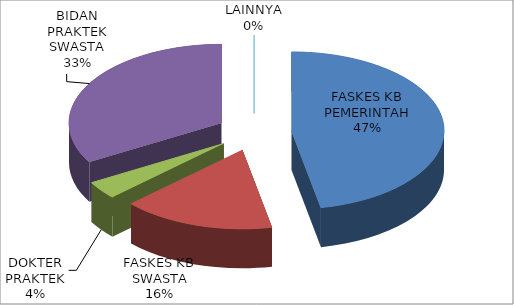
| Category | Series 0 |
|---|---|
| FASKES KB PEMERINTAH | 46.9 |
| FASKES KB SWASTA | 16.13 |
| DOKTER PRAKTEK | 3.66 |
| BIDAN PRAKTEK SWASTA | 33.3 |
| LAINNYA | 0 |